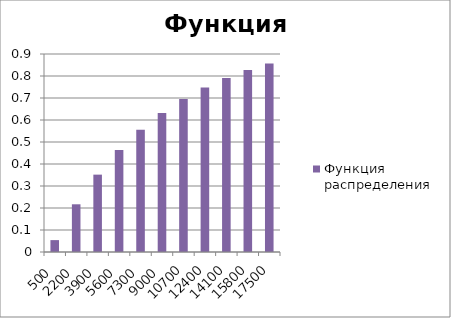
| Category | Функция распределения |
|---|---|
| 500.0 | 0.054 |
| 2200.0 | 0.217 |
| 3900.0 | 0.352 |
| 5600.0 | 0.463 |
| 7300.0 | 0.556 |
| 9000.0 | 0.632 |
| 10700.0 | 0.695 |
| 12400.0 | 0.748 |
| 14100.0 | 0.791 |
| 15800.0 | 0.827 |
| 17500.0 | 0.857 |